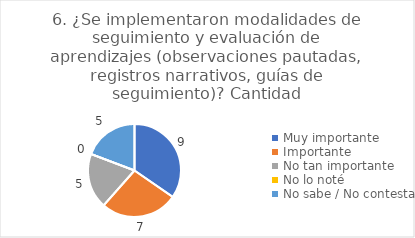
| Category | 6. ¿Se implementaron modalidades de seguimiento y evaluación de aprendizajes (observaciones pautadas, registros narrativos, guías de seguimiento)? |
|---|---|
| Muy importante  | 0.346 |
| Importante  | 0.269 |
| No tan importante  | 0.192 |
| No lo noté  | 0 |
| No sabe / No contesta | 0.192 |